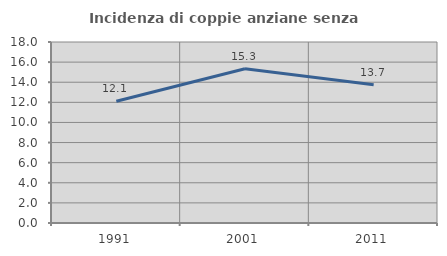
| Category | Incidenza di coppie anziane senza figli  |
|---|---|
| 1991.0 | 12.107 |
| 2001.0 | 15.335 |
| 2011.0 | 13.74 |